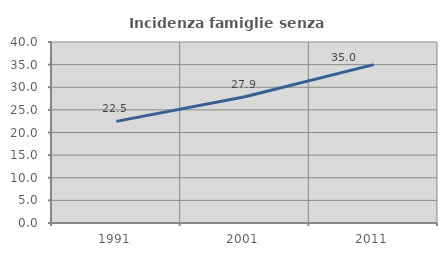
| Category | Incidenza famiglie senza nuclei |
|---|---|
| 1991.0 | 22.458 |
| 2001.0 | 27.887 |
| 2011.0 | 35.006 |